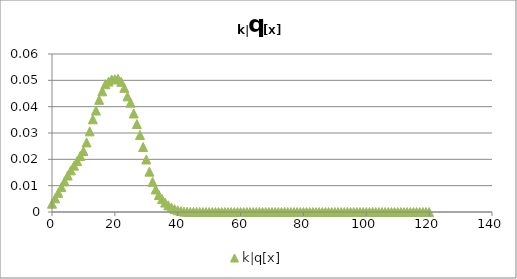
| Category | k|q[x] |
|---|---|
| 0.0 | 0.003 |
| 1.0 | 0.005 |
| 2.0 | 0.007 |
| 3.0 | 0.009 |
| 4.0 | 0.012 |
| 5.0 | 0.014 |
| 6.0 | 0.016 |
| 7.0 | 0.018 |
| 8.0 | 0.019 |
| 9.0 | 0.021 |
| 10.0 | 0.023 |
| 11.0 | 0.026 |
| 12.0 | 0.031 |
| 13.0 | 0.035 |
| 14.0 | 0.039 |
| 15.0 | 0.043 |
| 16.0 | 0.046 |
| 17.0 | 0.049 |
| 18.0 | 0.05 |
| 19.0 | 0.05 |
| 20.0 | 0.05 |
| 21.0 | 0.051 |
| 22.0 | 0.049 |
| 23.0 | 0.047 |
| 24.0 | 0.044 |
| 25.0 | 0.042 |
| 26.0 | 0.037 |
| 27.0 | 0.033 |
| 28.0 | 0.029 |
| 29.0 | 0.025 |
| 30.0 | 0.02 |
| 31.0 | 0.015 |
| 32.0 | 0.011 |
| 33.0 | 0.009 |
| 34.0 | 0.006 |
| 35.0 | 0.005 |
| 36.0 | 0.004 |
| 37.0 | 0.003 |
| 38.0 | 0.002 |
| 39.0 | 0.001 |
| 40.0 | 0.001 |
| 41.0 | 0 |
| 42.0 | 0 |
| 43.0 | 0 |
| 44.0 | 0 |
| 45.0 | 0 |
| 46.0 | 0 |
| 47.0 | 0 |
| 48.0 | 0 |
| 49.0 | 0 |
| 50.0 | 0 |
| 51.0 | 0 |
| 52.0 | 0 |
| 53.0 | 0 |
| 54.0 | 0 |
| 55.0 | 0 |
| 56.0 | 0 |
| 57.0 | 0 |
| 58.0 | 0 |
| 59.0 | 0 |
| 60.0 | 0 |
| 61.0 | 0 |
| 62.0 | 0 |
| 63.0 | 0 |
| 64.0 | 0 |
| 65.0 | 0 |
| 66.0 | 0 |
| 67.0 | 0 |
| 68.0 | 0 |
| 69.0 | 0 |
| 70.0 | 0 |
| 71.0 | 0 |
| 72.0 | 0 |
| 73.0 | 0 |
| 74.0 | 0 |
| 75.0 | 0 |
| 76.0 | 0 |
| 77.0 | 0 |
| 78.0 | 0 |
| 79.0 | 0 |
| 80.0 | 0 |
| 81.0 | 0 |
| 82.0 | 0 |
| 83.0 | 0 |
| 84.0 | 0 |
| 85.0 | 0 |
| 86.0 | 0 |
| 87.0 | 0 |
| 88.0 | 0 |
| 89.0 | 0 |
| 90.0 | 0 |
| 91.0 | 0 |
| 92.0 | 0 |
| 93.0 | 0 |
| 94.0 | 0 |
| 95.0 | 0 |
| 96.0 | 0 |
| 97.0 | 0 |
| 98.0 | 0 |
| 99.0 | 0 |
| 100.0 | 0 |
| 101.0 | 0 |
| 102.0 | 0 |
| 103.0 | 0 |
| 104.0 | 0 |
| 105.0 | 0 |
| 106.0 | 0 |
| 107.0 | 0 |
| 108.0 | 0 |
| 109.0 | 0 |
| 110.0 | 0 |
| 111.0 | 0 |
| 112.0 | 0 |
| 113.0 | 0 |
| 114.0 | 0 |
| 115.0 | 0 |
| 116.0 | 0 |
| 117.0 | 0 |
| 118.0 | 0 |
| 119.0 | 0 |
| 120.0 | 0 |